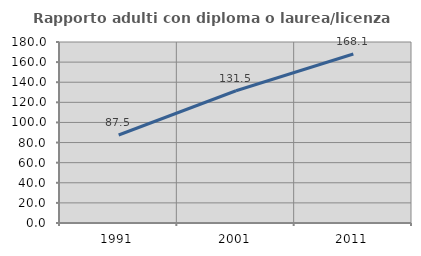
| Category | Rapporto adulti con diploma o laurea/licenza media  |
|---|---|
| 1991.0 | 87.542 |
| 2001.0 | 131.498 |
| 2011.0 | 168.063 |